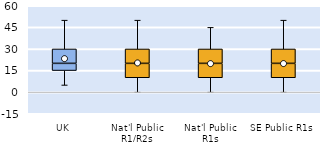
| Category | 25th | 50th | 75th |
|---|---|---|---|
| UK | 15 | 5 | 10 |
| Nat'l Public R1/R2s | 10 | 10 | 10 |
| Nat'l Public R1s | 10 | 10 | 10 |
| SE Public R1s | 10 | 10 | 10 |